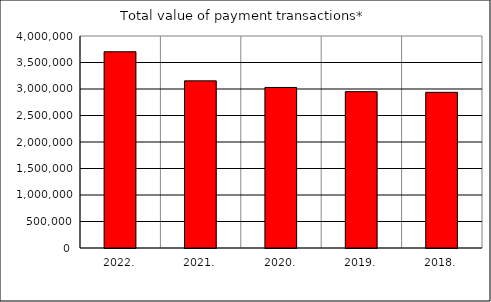
| Category | Total value of payment transactions* |
|---|---|
| 2022. | 3702644.188 |
| 2021. | 3153472.253 |
| 2020. | 3029085.749 |
| 2019. | 2949764.167 |
| 2018. | 2937307.09 |